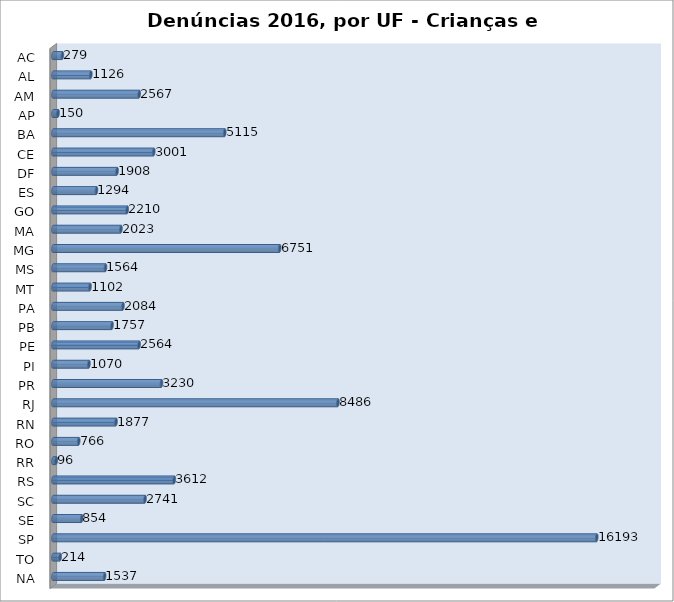
| Category | Series 0 |
|---|---|
| AC | 279 |
| AL | 1126 |
| AM | 2567 |
| AP | 150 |
| BA | 5115 |
| CE | 3001 |
| DF | 1908 |
| ES | 1294 |
| GO | 2210 |
| MA | 2023 |
| MG | 6751 |
| MS | 1564 |
| MT | 1102 |
| PA | 2084 |
| PB | 1757 |
| PE | 2564 |
| PI | 1070 |
| PR | 3230 |
| RJ | 8486 |
| RN | 1877 |
| RO | 766 |
| RR | 96 |
| RS | 3612 |
| SC | 2741 |
| SE | 854 |
| SP | 16193 |
| TO | 214 |
| NA | 1537 |